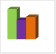
| Category | област Варна |
|---|---|
| летен сезон 2019  | 4697347 |
| летен сезон 2021  | 3018351 |
| летен сезон 2022 г.  | 3494545 |